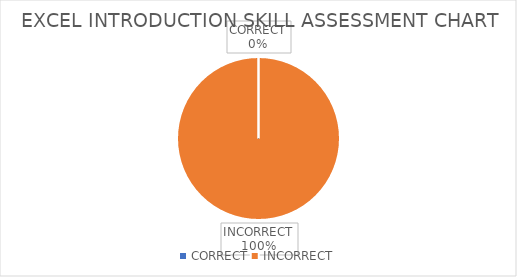
| Category | Series 0 |
|---|---|
| CORRECT | 0 |
| INCORRECT | 16 |